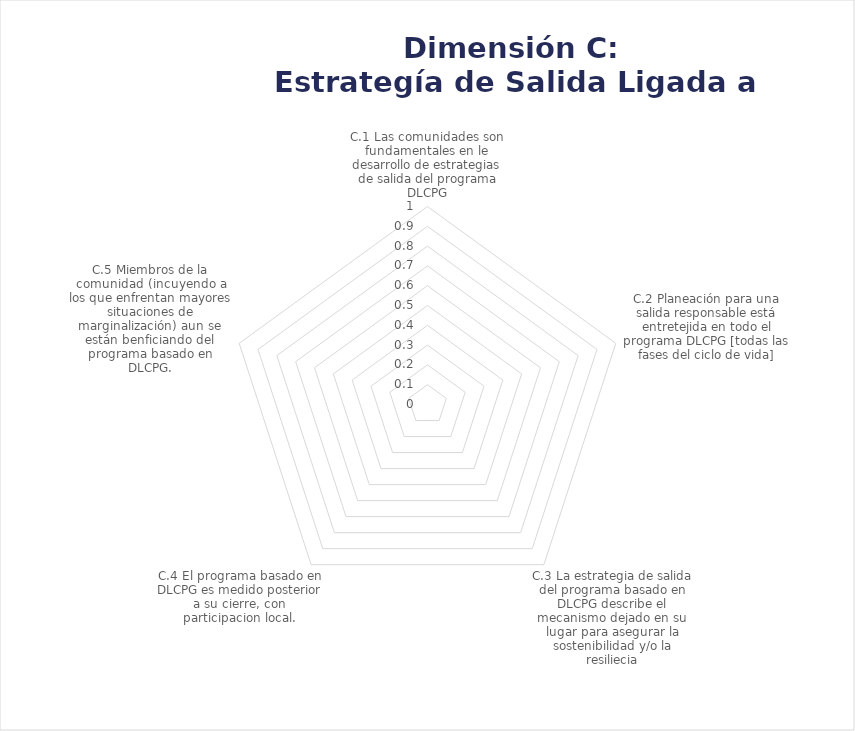
| Category | Series 0 |
|---|---|
| C.1 Las comunidades son fundamentales en le desarrollo de estrategias de salida del programa DLCPG | 0 |
| C.2 Planeación para una salida responsable está entretejida en todo el programa DLCPG [todas las fases del ciclo de vida] | 0 |
| C.3 La estrategia de salida del programa basado en DLCPG describe el mecanismo dejado en su lugar para asegurar la sostenibilidad y/o la resiliecia | 0 |
| C.4 El programa basado en DLCPG es medido posterior a su cierre, con participacion local. | 0 |
| C.5 Miembros de la comunidad (incuyendo a los que enfrentan mayores situaciones de marginalización) aun se están benficiando del programa basado en DLCPG. | 0 |